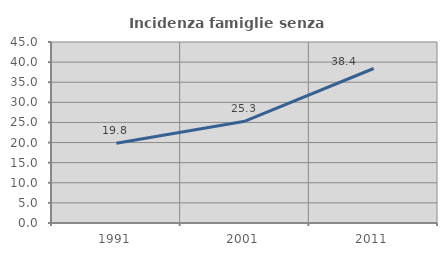
| Category | Incidenza famiglie senza nuclei |
|---|---|
| 1991.0 | 19.804 |
| 2001.0 | 25.313 |
| 2011.0 | 38.412 |